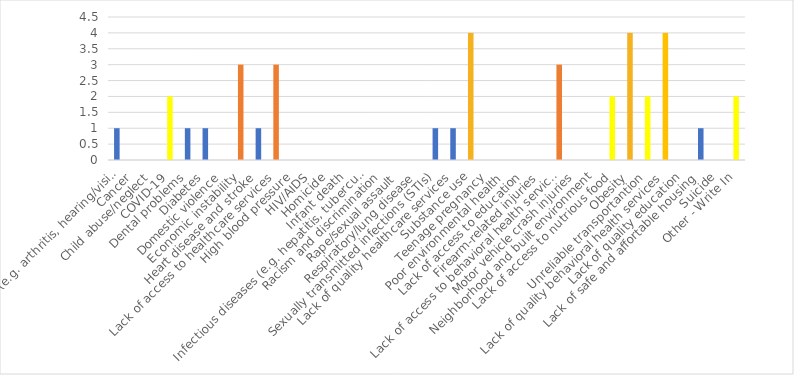
| Category | Number of Responses |
|---|---|
| Aging problems (e.g. arthritis, hearing/vision loss, etc.) | 1 |
| Cancer | 0 |
| Child abuse/neglect | 0 |
| COVID-19 | 2 |
| Dental problems | 1 |
| Diabetes | 1 |
| Domestic violence | 0 |
| Economic instability | 3 |
| Heart disease and stroke | 1 |
| Lack of access to healthcare services | 3 |
| High blood pressure | 0 |
| HIV/AIDS | 0 |
| Homicide | 0 |
| Infant death | 0 |
| Infectious diseases (e.g. hepatitis, tuberculosis, etc.) | 0 |
| Racism and discrimination | 0 |
| Rape/sexual assault | 0 |
| Respiratory/lung disease | 0 |
| Sexually transmitted infections (STIs) | 1 |
| Lack of quality healthcare services | 1 |
| Substance use | 4 |
| Teenage pregnancy | 0 |
| Poor environmental health | 0 |
| Lack of access to education | 0 |
| Firearm-related injuries | 0 |
| Lack of access to behavioral health services | 3 |
| Motor vehicle crash injuries | 0 |
| Neighborhood and built environment | 0 |
| Lack of access to nutrious food | 2 |
| Obesity | 4 |
| Unreliable transportantion | 2 |
| Lack of quality behavioral health services | 4 |
| Lack of quality education | 0 |
| Lack of safe and affortable housing | 1 |
| Suicide | 0 |
| Other - Write In | 2 |